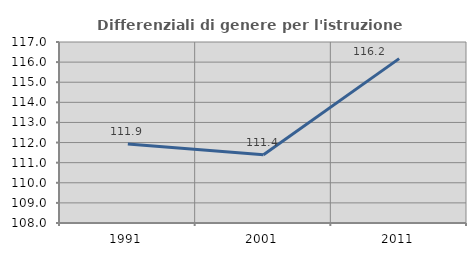
| Category | Differenziali di genere per l'istruzione superiore |
|---|---|
| 1991.0 | 111.926 |
| 2001.0 | 111.39 |
| 2011.0 | 116.173 |